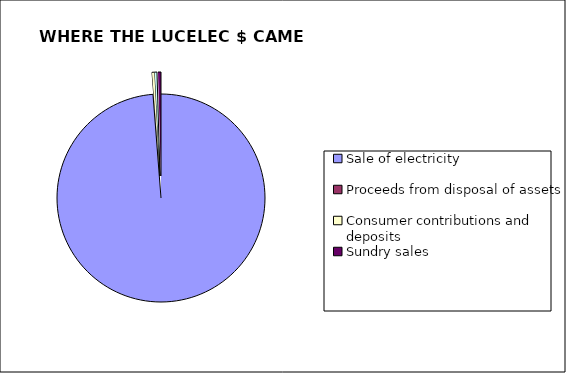
| Category | EC$'000s | cents |
|---|---|---|
| Sale of electricity | 264792 | 98.771 |
| Proceeds from disposal of assets | 13 | 0.005 |
| Consumer contributions and deposits | 1150 | 0.429 |
| Investment income | 894 | 0.333 |
| Sundry sales | 1238 | 0.462 |